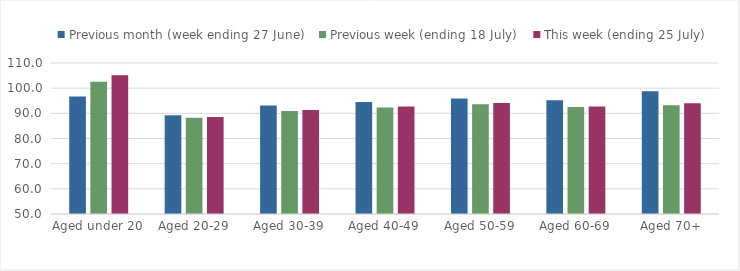
| Category | Previous month (week ending 27 June) | Previous week (ending 18 July) | This week (ending 25 July) |
|---|---|---|---|
| Aged under 20 | 96.665 | 102.592 | 105.106 |
| Aged 20-29 | 89.218 | 88.219 | 88.586 |
| Aged 30-39 | 93.136 | 90.974 | 91.337 |
| Aged 40-49 | 94.534 | 92.329 | 92.762 |
| Aged 50-59 | 95.879 | 93.613 | 94.077 |
| Aged 60-69 | 95.194 | 92.519 | 92.75 |
| Aged 70+ | 98.782 | 93.212 | 94.051 |